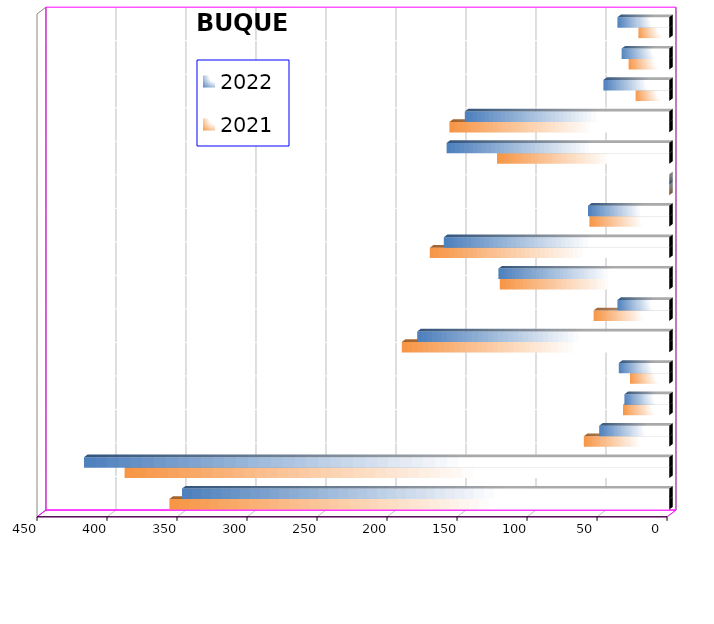
| Category | 2021 | 2022 |
|---|---|---|
| ICAVE | 357 | 348 |
| CICE | 389 | 418 |
| T. C. E. | 61 | 50 |
| CARGILL | 33 | 32 |
| TMV | 28 | 36 |
| SSA | 191 | 180 |
| SEPSA | 54 | 37 |
| VOPAK | 121 | 122 |
| CPV | 171 | 161 |
| EXCELLENCE | 57 | 58 |
| APASCO | 0 | 0 |
| SIPPB | 123 | 159 |
| PEMEX | 157 | 146 |
| PETRA | 24 | 47 |
| OPEVER | 29 | 34 |
| ESJ Renovable III | 22 | 37 |